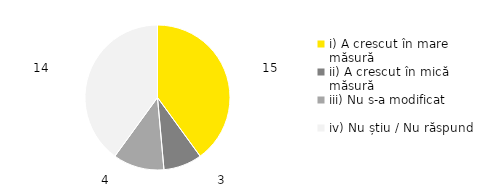
| Category | Total |
|---|---|
| i) A crescut în mare măsură | 0.4 |
| ii) A crescut în mică măsură | 0.086 |
| iii) Nu s-a modificat | 0.114 |
| iv) Nu știu / Nu răspund | 0.4 |